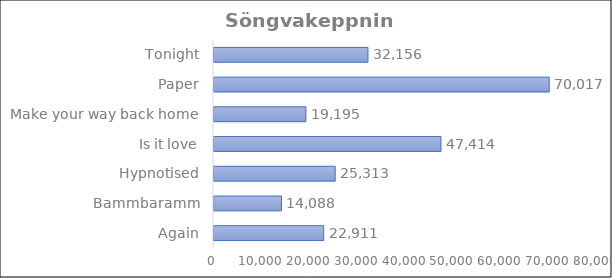
| Category | Series 0 |
|---|---|
| Again | 22911 |
| Bammbaramm | 14088 |
| Hypnotised | 25313 |
| Is it love | 47414 |
| Make your way back home | 19195 |
| Paper | 70017 |
| Tonight | 32156 |